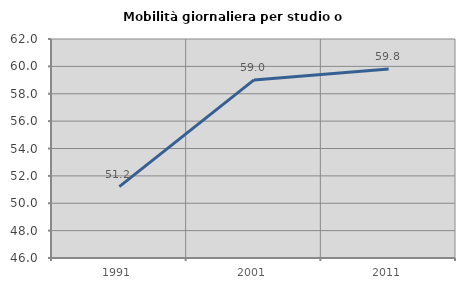
| Category | Mobilità giornaliera per studio o lavoro |
|---|---|
| 1991.0 | 51.212 |
| 2001.0 | 59.012 |
| 2011.0 | 59.813 |